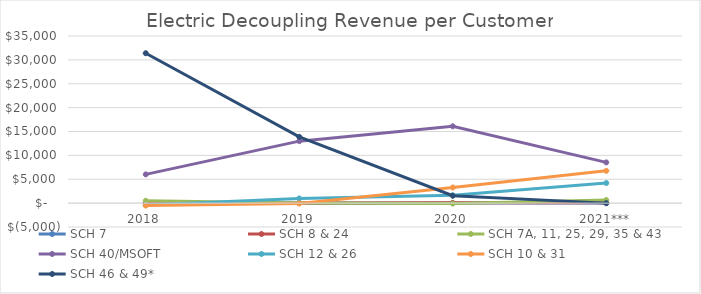
| Category | SCH 7 | SCH 8 & 24 | SCH 7A, 11, 25, 29, 35 & 43 | SCH 40/MSOFT | SCH 12 & 26 | SCH 10 & 31 | SCH 46 & 49* |
|---|---|---|---|---|---|---|---|
| 2018 | -2.879 | 26.998 | 495.401 | 6018.449 | -414.088 | -510.441 | 31395.176 |
| 2019 | -0.967 | 48.231 | 10.49 | 12981.056 | 980.708 | -71.432 | 13877.844 |
| 2020 | 7.764 | 57.364 | -98.394 | 16092.367 | 1642.855 | 3273.565 | 1546.161 |
| 2021*** | 0.568 | 69.661 | 642.374 | 8532.699 | 4207.611 | 6760.917 | 0 |